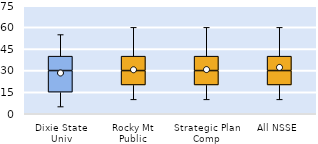
| Category | 25th | 50th | 75th |
|---|---|---|---|
| Dixie State Univ | 15 | 15 | 10 |
| Rocky Mt Public | 20 | 10 | 10 |
| Strategic Plan Comp | 20 | 10 | 10 |
| All NSSE | 20 | 10 | 10 |